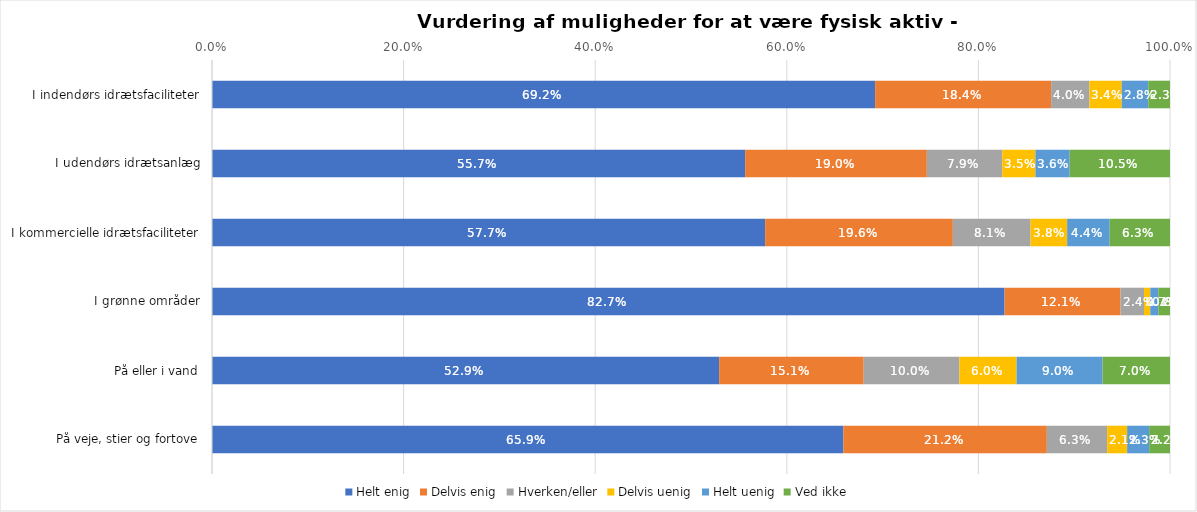
| Category | Helt enig | Delvis enig | Hverken/eller | Delvis uenig | Helt uenig | Ved ikke |
|---|---|---|---|---|---|---|
| I indendørs idrætsfaciliteter | 0.692 | 0.184 | 0.04 | 0.034 | 0.028 | 0.023 |
| I udendørs idrætsanlæg | 0.557 | 0.19 | 0.079 | 0.035 | 0.036 | 0.105 |
| I kommercielle idrætsfaciliteter | 0.577 | 0.196 | 0.081 | 0.038 | 0.044 | 0.063 |
| I grønne områder | 0.827 | 0.121 | 0.024 | 0.007 | 0.008 | 0.012 |
| På eller i vand | 0.529 | 0.151 | 0.1 | 0.06 | 0.09 | 0.07 |
| På veje, stier og fortove | 0.659 | 0.212 | 0.063 | 0.021 | 0.023 | 0.022 |